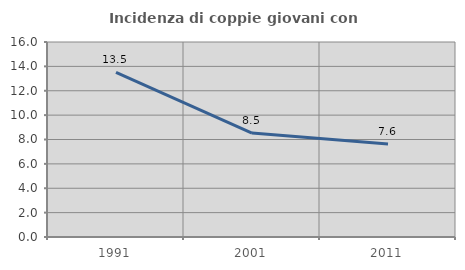
| Category | Incidenza di coppie giovani con figli |
|---|---|
| 1991.0 | 13.515 |
| 2001.0 | 8.529 |
| 2011.0 | 7.632 |